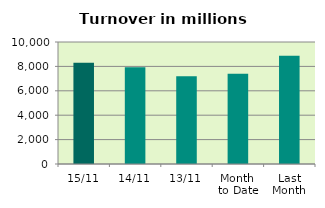
| Category | Series 0 |
|---|---|
| 15/11 | 8299.602 |
| 14/11 | 7928.336 |
| 13/11 | 7185.695 |
| Month 
to Date | 7407.422 |
| Last
Month | 8866.758 |